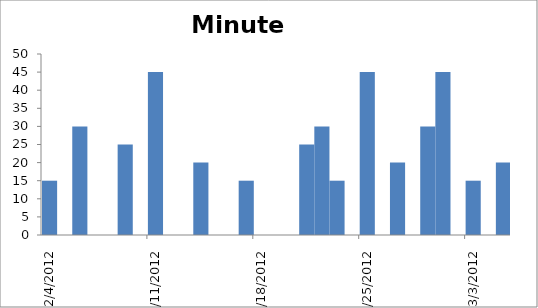
| Category | Minutes |
|---|---|
| 2/4/12 | 15 |
| 2/6/12 | 30 |
| 2/9/12 | 25 |
| 2/11/12 | 45 |
| 2/14/12 | 20 |
| 2/17/12 | 15 |
| 2/21/12 | 25 |
| 2/22/12 | 30 |
| 2/23/12 | 15 |
| 2/25/12 | 45 |
| 2/27/12 | 20 |
| 2/29/12 | 30 |
| 3/1/12 | 45 |
| 3/3/12 | 15 |
| 3/5/12 | 20 |